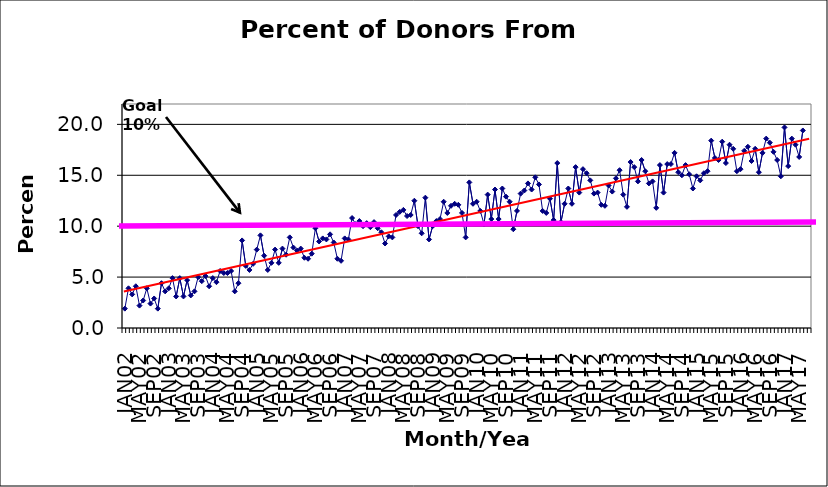
| Category | Series 0 |
|---|---|
| JAN02 | 1.9 |
| FEB02 | 3.9 |
| MAR02 | 3.3 |
| APR02 | 4.1 |
| MAY02 | 2.2 |
| JUN02 | 2.7 |
| JUL02 | 3.9 |
| AUG02 | 2.4 |
| SEP02 | 2.9 |
| OCT02 | 1.9 |
| NOV02 | 4.4 |
| DEC02 | 3.6 |
| JAN03 | 3.9 |
| FEB03 | 4.9 |
| MAR03 | 3.1 |
| APR03 | 4.9 |
| MAY03 | 3.1 |
| JUN03 | 4.7 |
| JUL03 | 3.2 |
| AUG03 | 3.6 |
| SEP03 | 5 |
| OCT03 | 4.6 |
| NOV03 | 5.1 |
| DEC03 | 4.1 |
| JAN04 | 4.9 |
| FEB04 | 4.5 |
| MAR04 | 5.6 |
| APR04 | 5.4 |
| MAY04 | 5.4 |
| JUN04 | 5.6 |
| JUL04 | 3.6 |
| AUG04 | 4.4 |
| SEP04 | 8.6 |
| OCT04 | 6.1 |
| NOV04 | 5.7 |
| DEC04 | 6.3 |
| JAN05 | 7.7 |
| FEB05 | 9.1 |
| MAR05 | 7.1 |
| APR05 | 5.7 |
| MAY05 | 6.4 |
| JUN05 | 7.7 |
| JUL05 | 6.4 |
| AUG05 | 7.8 |
| SEP05 | 7.2 |
| OCT05 | 8.9 |
| NOV05 | 7.9 |
| DEC05 | 7.6 |
| JAN06 | 7.8 |
| FEB06 | 6.9 |
| MAR06 | 6.8 |
| APR06 | 7.3 |
| MAY06 | 9.8 |
| JUN06 | 8.5 |
| JUL06 | 8.8 |
| AUG06 | 8.7 |
| SEP06 | 9.2 |
| OCT06 | 8.4 |
| NOV06 | 6.8 |
| DEC06 | 6.6 |
| JAN07 | 8.8 |
| FEB07 | 8.7 |
| MAR07 | 10.8 |
| APR07 | 10.2 |
| MAY07 | 10.5 |
| JUN07 | 10 |
| JUL07 | 10.3 |
| AUG07 | 9.9 |
| SEP07 | 10.4 |
| OCT07 | 9.8 |
| NOV07 | 9.4 |
| DEC07 | 8.3 |
| JAN08 | 9 |
| FEB08 | 8.9 |
| MAR08 | 11.1 |
| APR08 | 11.4 |
| MAY08 | 11.6 |
| JUN08 | 11 |
| JUL08 | 11.1 |
| AUG08 | 12.5 |
| SEP08 | 10 |
| OCT08 | 9.3 |
| NOV08 | 12.8 |
| DEC08 | 8.7 |
| JAN09 | 10 |
| FEB09 | 10.5 |
| MAR09 | 10.7 |
| APR09 | 12.4 |
| MAY09 | 11.3 |
| JUN09 | 12 |
| JUL09 | 12.2 |
| AUG09 | 12.1 |
| SEP09 | 11.3 |
| OCT09 | 8.9 |
| NOV09 | 14.3 |
| DEC09 | 12.2 |
| JAN10 | 12.4 |
| FEB10 | 11.5 |
| MAR10 | 10.2 |
| APR10 | 13.1 |
| MAY10 | 10.7 |
| JUN10 | 13.6 |
| JUL10 | 10.7 |
| AUG10 | 13.7 |
| SEP10 | 12.9 |
| OCT10 | 12.4 |
| NOV10 | 9.7 |
| DEC10 | 11.5 |
| JAN11 | 13.2 |
| FEB11 | 13.5 |
| MAR11 | 14.2 |
| APR11 | 13.6 |
| MAY11 | 14.8 |
| JUN11 | 14.1 |
| JUL11 | 11.5 |
| AUG11 | 11.3 |
| SEP11 | 12.7 |
| OCT11 | 10.6 |
| NOV11 | 16.2 |
| DEC11 | 10.4 |
| JAN12 | 12.2 |
| FEB12 | 13.7 |
| MAR12 | 12.2 |
| APR12 | 15.8 |
| MAY12 | 13.3 |
| JUN12 | 15.6 |
| JUL12 | 15.2 |
| AUG12 | 14.5 |
| SEP12 | 13.2 |
| OCT12 | 13.3 |
| NOV12 | 12.1 |
| DEC12 | 12 |
| JAN13 | 14 |
| FEB13 | 13.4 |
| MAR13 | 14.7 |
| APR13 | 15.5 |
| MAY13 | 13.1 |
| JUN13 | 11.9 |
| JUL13 | 16.3 |
| AUG13 | 15.8 |
| SEP13 | 14.4 |
| OCT13 | 16.5 |
| NOV13 | 15.4 |
| DEC13 | 14.2 |
| JAN14 | 14.4 |
| FEB14 | 11.8 |
| MAR14 | 16 |
| APR14 | 13.3 |
| MAY14 | 16.1 |
| JUN14 | 16.1 |
| JUL14 | 17.2 |
| AUG14 | 15.3 |
| SEP14 | 15 |
| OCT14 | 16 |
| NOV14 | 15.1 |
| DEC14 | 13.7 |
| JAN15 | 14.9 |
| FEB15 | 14.5 |
| MAR15 | 15.2 |
| APR15 | 15.4 |
| MAY15 | 18.4 |
| JUN15 | 16.7 |
| JUL15 | 16.5 |
| AUG15 | 18.3 |
| SEP15 | 16.2 |
| OCT15 | 18 |
| NOV15 | 17.6 |
| DEC15 | 15.4 |
| JAN16 | 15.6 |
| FEB16 | 17.4 |
| MAR16 | 17.8 |
| APR16 | 16.4 |
| MAY16 | 17.6 |
| JUN16 | 15.3 |
| JUL16 | 17.2 |
| AUG16 | 18.6 |
| SEP16 | 18.2 |
| OCT16 | 17.3 |
| NOV16 | 16.5 |
| DEC16 | 14.9 |
| JAN17 | 19.7 |
| FEB17 | 15.9 |
| MAR17 | 18.6 |
| APR17 | 18 |
| MAY17 | 16.8 |
| JUN17 | 19.4 |